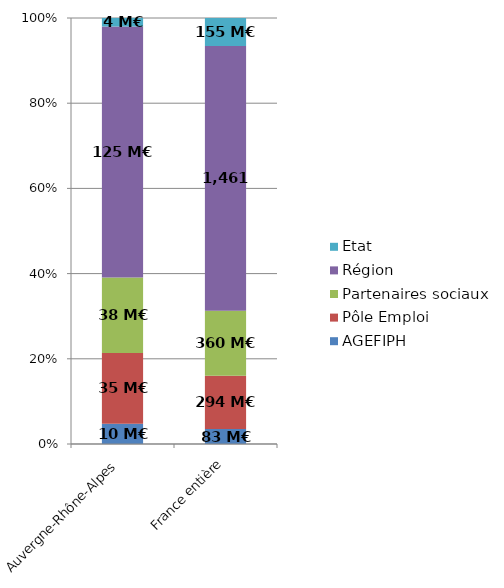
| Category | AGEFIPH | Pôle Emploi | Partenaires sociaux | Région | Etat |
|---|---|---|---|---|---|
| Auvergne-Rhône-Alpes | 10.063 | 35.39 | 37.694 | 125.393 | 4.286 |
| France entière | 82.716 | 293.959 | 359.593 | 1461.057 | 154.74 |